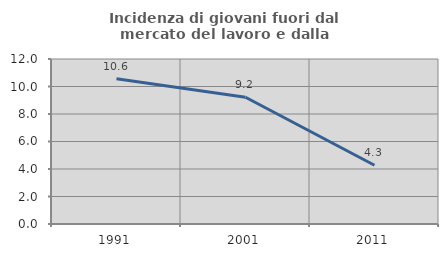
| Category | Incidenza di giovani fuori dal mercato del lavoro e dalla formazione  |
|---|---|
| 1991.0 | 10.563 |
| 2001.0 | 9.22 |
| 2011.0 | 4.274 |